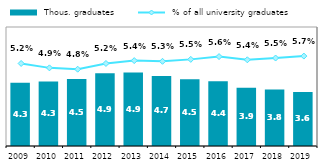
| Category |  Thous. graduates |
|---|---|
| 2009 | 4.253 |
| 2010 | 4.337 |
| 2011 | 4.507 |
| 2012 | 4.893 |
| 2013 | 4.934 |
| 2014 | 4.711 |
| 2015 | 4.479 |
| 2016 | 4.361 |
| 2017 | 3.916 |
| 2018 | 3.802 |
| 2019 | 3.638 |